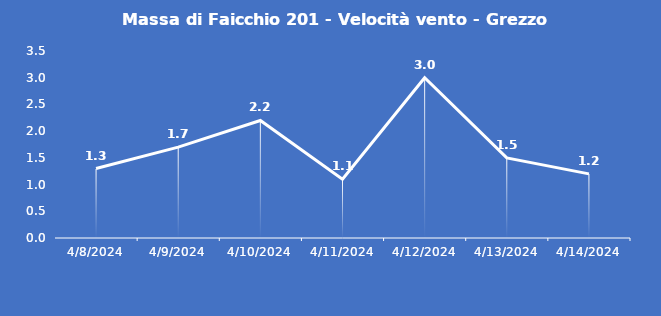
| Category | Massa di Faicchio 201 - Velocità vento - Grezzo (m/s) |
|---|---|
| 4/8/24 | 1.3 |
| 4/9/24 | 1.7 |
| 4/10/24 | 2.2 |
| 4/11/24 | 1.1 |
| 4/12/24 | 3 |
| 4/13/24 | 1.5 |
| 4/14/24 | 1.2 |